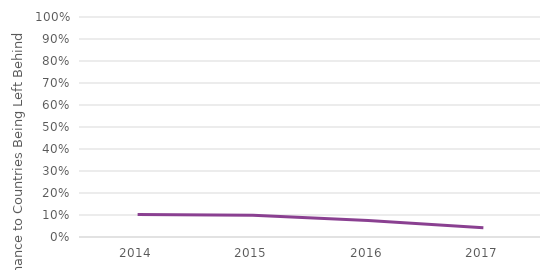
| Category | CBLB |
|---|---|
| 2014.0 | 0.102 |
| 2015.0 | 0.099 |
| 2016.0 | 0.075 |
| 2017.0 | 0.042 |